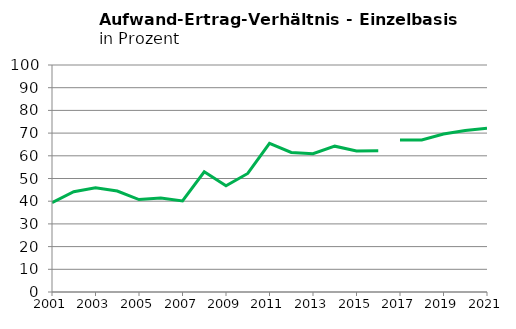
| Category | Aufwand-Ertrag-Verhältnis in % |
|---|---|
| 2001.0 | 39.396 |
| 2002.0 | 44.154 |
| 2003.0 | 45.958 |
| 2004.0 | 44.459 |
| 2005.0 | 40.732 |
| 2006.0 | 41.358 |
| 2007.0 | 40.132 |
| 2008.0 | 52.973 |
| 2009.0 | 46.791 |
| 2010.0 | 52.215 |
| 2011.0 | 65.472 |
| 2012.0 | 61.481 |
| 2013.0 | 60.911 |
| 2014.0 | 64.241 |
| 2015.0 | 62.082 |
| 2016.0 | 62.198 |
| 2017.0 | 66.911 |
| 2018.0 | 66.947 |
| 2019.0 | 69.568 |
| 2020.0 | 71.184 |
| 2021.0 | 72.158 |